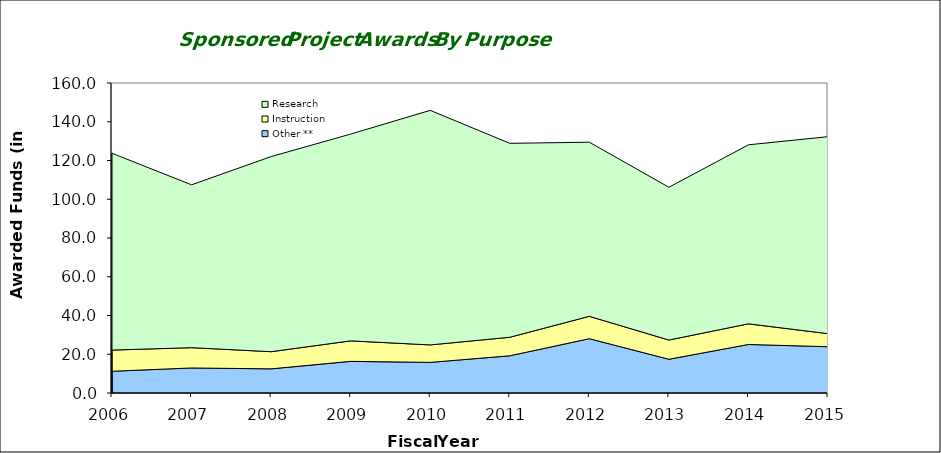
| Category | Other ** | Instruction | Research |
|---|---|---|---|
| 2006.0 | 11219718 | 10932352 | 101586645 |
| 2007.0 | 12923580 | 10473404 | 84050822 |
| 2008.0 | 12461556 | 8854473 | 100702258 |
| 2009.0 | 16323762 | 10579962 | 106738539 |
| 2010.0 | 15802845 | 9016188 | 121058086 |
| 2011.0 | 19201991 | 9571284 | 100091965 |
| 2012.0 | 28029550 | 11550592 | 89859671 |
| 2013.0 | 17415722 | 9918293 | 78852872 |
| 2014.0 | 25056053 | 10647546 | 92392249 |
| 2015.0 | 23883539 | 6730586 | 101678675 |